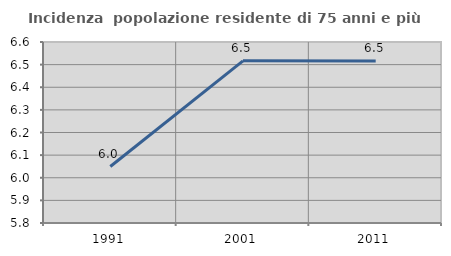
| Category | Incidenza  popolazione residente di 75 anni e più |
|---|---|
| 1991.0 | 6.05 |
| 2001.0 | 6.517 |
| 2011.0 | 6.516 |